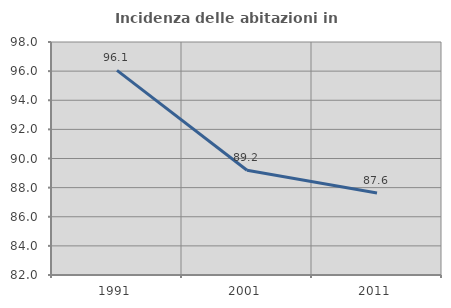
| Category | Incidenza delle abitazioni in proprietà  |
|---|---|
| 1991.0 | 96.053 |
| 2001.0 | 89.189 |
| 2011.0 | 87.634 |